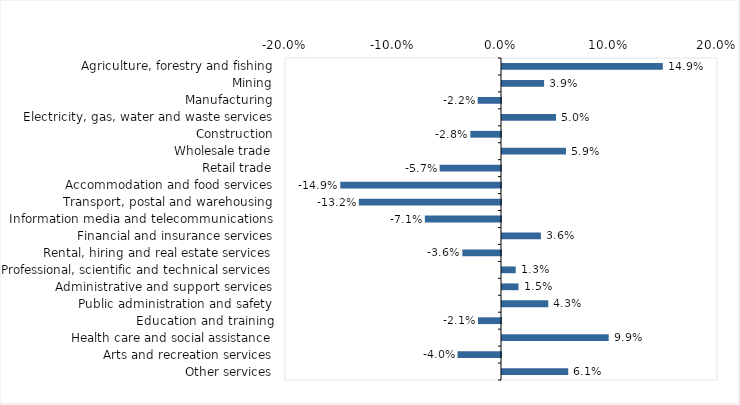
| Category | This week |
|---|---|
| Agriculture, forestry and fishing | 0.149 |
| Mining | 0.039 |
| Manufacturing | -0.022 |
| Electricity, gas, water and waste services | 0.05 |
| Construction | -0.028 |
| Wholesale trade | 0.059 |
| Retail trade | -0.057 |
| Accommodation and food services | -0.149 |
| Transport, postal and warehousing | -0.132 |
| Information media and telecommunications | -0.07 |
| Financial and insurance services | 0.036 |
| Rental, hiring and real estate services | -0.036 |
| Professional, scientific and technical services | 0.013 |
| Administrative and support services | 0.015 |
| Public administration and safety | 0.043 |
| Education and training | -0.021 |
| Health care and social assistance | 0.099 |
| Arts and recreation services | -0.04 |
| Other services | 0.061 |